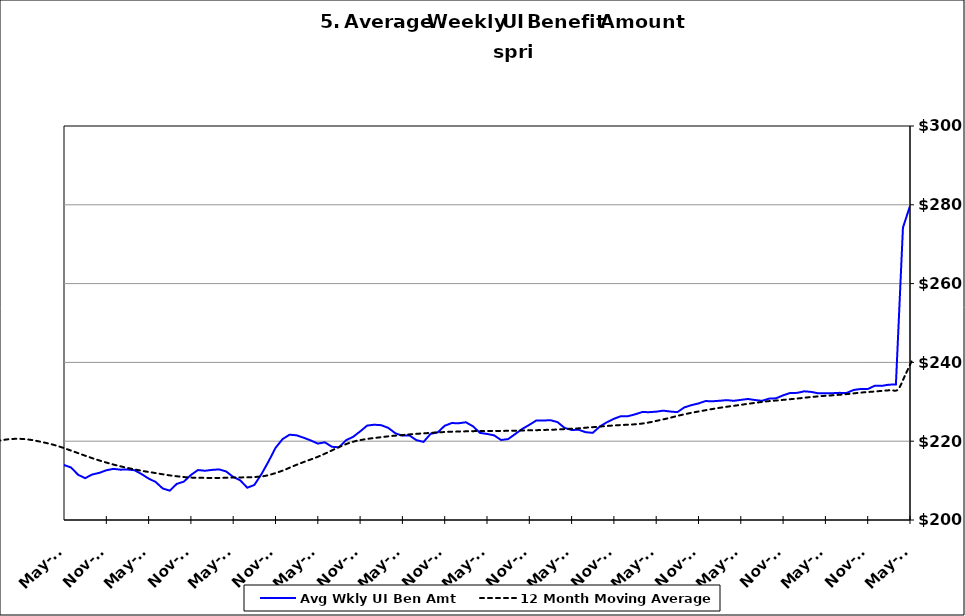
| Category | Avg Wkly UI Ben Amt |
|---|---|
| 1995-01-31 | 152.517 |
| 1995-02-28 | 151.164 |
| 1995-03-31 | 148.4 |
| 1995-04-30 | 146.034 |
| 1995-05-31 | 146.738 |
| 1995-06-30 | 147.885 |
| 1995-07-31 | 145.798 |
| 1995-08-31 | 144.052 |
| 1995-09-30 | 147.334 |
| 1995-10-31 | 151.535 |
| 1995-11-30 | 152.903 |
| 1995-12-31 | 153.258 |
| 1996-01-15 | 153.468 |
| 1996-02-15 | 153.032 |
| 1996-03-15 | 155.453 |
| 1996-04-15 | 148.614 |
| 1996-05-15 | 148.648 |
| 1996-06-15 | 150.145 |
| 1996-07-15 | 147.052 |
| 1996-08-15 | 146.042 |
| 1996-09-15 | 149.978 |
| 1996-10-15 | 151.319 |
| 1996-11-15 | 153.295 |
| 1996-12-15 | 155.775 |
| 1997-01-15 | 154.813 |
| 1997-02-15 | 151.102 |
| 1997-03-15 | 149.222 |
| 1997-04-15 | 145.178 |
| 1997-05-31 | 145.194 |
| 1997-06-30 | 146.718 |
| 1997-07-31 | 142.224 |
| 1997-08-31 | 142.382 |
| 1997-09-30 | 143.123 |
| 1997-10-31 | 146.797 |
| 1997-11-30 | 148.163 |
| 1997-12-31 | 147.967 |
| 1998-01-31 | 147.87 |
| 1998-02-28 | 147.591 |
| 1998-03-31 | 147.262 |
| 1998-04-30 | 144.746 |
| 1998-05-31 | 146.093 |
| 1998-06-30 | 147.355 |
| 1998-07-31 | 146.079 |
| 1998-08-31 | 147.387 |
| 1998-09-30 | 147.529 |
| 1998-10-31 | 152.825 |
| 1998-11-30 | 156.171 |
| 1998-12-31 | 156.424 |
| 1999-01-31 | 157.388 |
| 1999-02-28 | 157.868 |
| 1999-03-31 | 157.505 |
| 1999-04-30 | 153.987 |
| 1999-05-31 | 153.665 |
| 1999-06-30 | 153.746 |
| 1999-07-31 | 154.09 |
| 1999-08-31 | 156.162 |
| 1999-09-30 | 157.136 |
| 1999-10-31 | 162.476 |
| 1999-11-30 | 163.291 |
| 1999-12-31 | 165.621 |
| 2000-01-31 | 166.425 |
| 2000-02-29 | 165.378 |
| 2000-03-31 | 163.05 |
| 2000-04-30 | 161.908 |
| 2000-05-31 | 160.484 |
| 2000-06-30 | 160.865 |
| 2000-07-31 | 161.011 |
| 2000-08-31 | 158.845 |
| 2000-09-30 | 161.127 |
| 2000-10-31 | 163.997 |
| 2000-11-30 | 164.759 |
| 2000-12-31 | 166.66 |
| 2001-01-31 | 168.164 |
| 2001-02-28 | 169.339 |
| 2001-03-31 | 169.617 |
| 2001-04-30 | 170.349 |
| 2001-05-31 | 168.417 |
| 2001-06-30 | 169.418 |
| 2001-07-31 | 169.733 |
| 2001-08-31 | 170.578 |
| 2001-09-30 | 174.36 |
| 2001-10-31 | 176.952 |
| 2001-11-30 | 178.489 |
| 2001-12-31 | 179.805 |
| 2002-01-31 | 179.529 |
| 2002-02-28 | 179.269 |
| 2002-03-31 | 178.588 |
| 2002-04-30 | 177.594 |
| 2002-05-31 | 175.021 |
| 2002-06-30 | 175.298 |
| 2002-07-31 | 173.853 |
| 2002-08-31 | 172.776 |
| 2002-09-30 | 174.657 |
| 2002-10-31 | 175.648 |
| 2002-11-30 | 176.299 |
| 2002-12-31 | 177.239 |
| 2003-01-31 | 176.943 |
| 2003-02-28 | 176.988 |
| 2003-03-31 | 175.698 |
| 2003-04-30 | 172.857 |
| 2003-05-31 | 171.934 |
| 2003-06-30 | 171.956 |
| 2003-07-31 | 170.949 |
| 2003-08-31 | 171.311 |
| 2003-09-30 | 171.909 |
| 2003-10-31 | 172.692 |
| 2003-11-30 | 173.689 |
| 2003-12-31 | 174.176 |
| 2004-01-31 | 173.867 |
| 2004-02-29 | 173.648 |
| 2004-03-31 | 172.152 |
| 2004-04-30 | 170.705 |
| 2004-05-31 | 170.684 |
| 2004-06-30 | 170.635 |
| 2004-07-31 | 171.229 |
| 2004-08-31 | 175.375 |
| 2004-09-30 | 182.737 |
| 2004-10-31 | 187.554 |
| 2004-11-30 | 191.316 |
| 2004-12-31 | 194.602 |
| 2005-01-31 | 196.38 |
| 2005-02-28 | 196.569 |
| 2005-03-31 | 195.523 |
| 2005-04-30 | 193.655 |
| 2005-05-31 | 193.953 |
| 2005-06-30 | 192.728 |
| 2005-07-31 | 192.211 |
| 2005-08-31 | 191.133 |
| 2005-09-30 | 194.339 |
| 2005-10-31 | 196.819 |
| 2005-11-30 | 198.473 |
| 2005-12-31 | 199.545 |
| 2006-01-31 | 199.965 |
| 2006-02-28 | 200.117 |
| 2006-03-31 | 198.335 |
| 2006-04-30 | 197.258 |
| 2006-05-31 | 195.225 |
| 2006-06-30 | 195.734 |
| 2006-07-31 | 194.92 |
| 2006-08-31 | 194.282 |
| 2006-09-30 | 196.801 |
| 2006-10-31 | 199.137 |
| 2006-11-30 | 201.183 |
| 2006-12-31 | 202.121 |
| 2007-01-31 | 202.615 |
| 2007-02-28 | 202.465 |
| 2007-03-31 | 201.75 |
| 2007-04-30 | 200.344 |
| 2007-05-31 | 198.851 |
| 2007-06-30 | 198.258 |
| 2007-07-30 | 197.654 |
| 2007-08-31 | 198.405 |
| 2007-09-30 | 200.563 |
| 2007-10-31 | 201.857 |
| 2007-11-15 | 203.345 |
| 2007-12-15 09:36:00 | 219.243 |
| 2008-01-14 19:12:00 | 219.658 |
| 2008-02-14 04:48:00 | 220.121 |
| 2008-03-15 14:24:00 | 219.456 |
| 2008-04-15 | 217.672 |
| 2008-05-15 09:36:00 | 216.637 |
| 2008-06-14 19:12:00 | 216.035 |
| 2008-07-15 04:48:00 | 213.916 |
| 2008-08-14 14:24:00 | 214.008 |
| 2008-09-14 | 216.475 |
| 2008-10-14 09:36:00 | 217.836 |
| 2008-11-13 19:12:00 | 219.819 |
| 2008-12-14 04:48:00 | 221.529 |
| 2009-01-13 14:24:00 | 222.143 |
| 2009-02-13 | 222.091 |
| 2009-03-15 09:36:00 | 222.273 |
| 2009-04-14 19:12:00 | 222.011 |
| 2009-05-15 04:48:00 | 221.558 |
| 2009-06-14 14:24:00 | 220.761 |
| 2009-07-15 | 219.225 |
| 2009-08-14 09:36:00 | 218.364 |
| 2009-09-13 19:12:00 | 218.814 |
| 2009-10-14 04:48:00 | 218.744 |
| 2009-11-13 14:24:00 | 218.719 |
| 2009-12-14 | 218.779 |
| 2010-01-13 09:36:00 | 217.988 |
| 2010-02-12 19:12:00 | 217.521 |
| 2010-03-15 04:48:00 | 216.93 |
| 2010-04-14 14:24:00 | 215.638 |
| 2010-05-15 | 213.953 |
| 2010-06-14 09:36:00 | 213.326 |
| 2010-07-14 19:12:00 | 211.48 |
| 2010-08-14 04:48:00 | 210.615 |
| 2010-09-13 14:24:00 | 211.554 |
| 2010-10-14 | 211.956 |
| 2010-11-13 09:36:00 | 212.619 |
| 2010-12-13 19:12:00 | 212.979 |
| 2011-01-13 04:48:00 | 212.778 |
| 2011-02-12 14:24:00 | 212.812 |
| 2011-03-15 | 212.631 |
| 2011-04-14 09:36:00 | 211.659 |
| 2011-05-14 19:12:00 | 210.522 |
| 2011-06-14 04:48:00 | 209.652 |
| 2011-07-14 14:24:00 | 208.005 |
| 2011-08-14 | 207.451 |
| 2011-09-13 09:36:00 | 209.173 |
| 2011-10-13 19:12:00 | 209.736 |
| 2011-11-13 04:48:00 | 211.422 |
| 2011-12-13 14:24:00 | 212.679 |
| 2012-01-13 | 212.502 |
| 2012-02-12 09:36:00 | 212.715 |
| 2012-03-13 19:12:00 | 212.846 |
| 2012-04-13 04:48:00 | 212.323 |
| 2012-05-13 14:24:00 | 210.934 |
| 2012-06-13 | 210.073 |
| 2012-07-13 09:36:00 | 208.192 |
| 2012-08-12 19:12:00 | 208.902 |
| 2012-09-12 04:48:00 | 211.616 |
| 2012-10-12 14:24:00 | 214.814 |
| 2012-11-12 | 218.296 |
| 2012-12-12 09:36:00 | 220.532 |
| 2013-01-11 19:12:00 | 221.653 |
| 2013-02-11 04:48:00 | 221.49 |
| 2013-03-13 14:24:00 | 220.877 |
| 2013-04-13 | 220.198 |
| 2013-05-13 09:36:00 | 219.395 |
| 2013-06-12 19:12:00 | 219.716 |
| 2013-07-13 04:48:00 | 218.588 |
| 2013-08-12 14:24:00 | 218.444 |
| 2013-09-12 | 220.248 |
| 2013-10-12 09:36:00 | 221.094 |
| 2013-11-11 19:12:00 | 222.471 |
| 2013-12-12 04:48:00 | 223.964 |
| 2014-01-11 14:24:00 | 224.183 |
| 2014-02-11 | 224.065 |
| 2014-03-13 09:36:00 | 223.376 |
| 2014-04-12 19:12:00 | 222.017 |
| 2014-05-13 04:48:00 | 221.409 |
| 2014-06-12 14:24:00 | 221.458 |
| 2014-07-13 | 220.256 |
| 2014-08-12 09:36:00 | 219.823 |
| 2014-09-11 19:12:00 | 221.87 |
| 2014-10-12 04:48:00 | 222.223 |
| 2014-11-11 14:24:00 | 223.919 |
| 2014-12-12 | 224.606 |
| 2015-01-11 09:36:00 | 224.554 |
| 2015-02-10 19:12:00 | 224.808 |
| 2015-03-13 04:48:00 | 223.795 |
| 2015-04-12 14:24:00 | 222.11 |
| 2015-05-13 | 221.845 |
| 2015-06-12 09:36:00 | 221.492 |
| 2015-07-12 19:12:00 | 220.308 |
| 2015-08-12 04:48:00 | 220.534 |
| 2015-09-11 14:24:00 | 221.819 |
| 2015-10-12 | 223.117 |
| 2015-11-11 09:36:00 | 224.146 |
| 2015-12-11 19:12:00 | 225.264 |
| 2016-01-11 04:48:00 | 225.247 |
| 2016-02-10 14:24:00 | 225.331 |
| 2016-03-12 | 224.849 |
| 2016-04-11 09:36:00 | 223.376 |
| 2016-05-11 19:12:00 | 222.856 |
| 2016-06-11 04:48:00 | 222.895 |
| 2016-07-11 14:24:00 | 222.285 |
| 2016-08-11 | 222.119 |
| 2016-09-10 09:36:00 | 223.72 |
| 2016-10-10 19:12:00 | 224.805 |
| 2016-11-10 04:48:00 | 225.687 |
| 2016-12-10 14:24:00 | 226.349 |
| 2017-01-10 | 226.348 |
| 2017-02-09 09:36:00 | 226.816 |
| 2017-03-11 19:12:00 | 227.395 |
| 2017-04-11 04:48:00 | 227.37 |
| 2017-05-11 14:24:00 | 227.492 |
| 2017-06-11 | 227.755 |
| 2017-07-11 09:36:00 | 227.522 |
| 2017-08-10 19:12:00 | 227.382 |
| 2017-09-10 04:48:00 | 228.581 |
| 2017-10-10 14:24:00 | 229.154 |
| 2017-11-10 | 229.58 |
| 2017-12-10 09:36:00 | 230.186 |
| 2018-01-09 19:12:00 | 230.136 |
| 2018-02-09 04:48:00 | 230.265 |
| 2018-03-11 14:24:00 | 230.427 |
| 2018-04-11 | 230.25 |
| 2018-05-11 09:36:00 | 230.487 |
| 2018-06-10 19:12:00 | 230.714 |
| 2018-07-11 04:48:00 | 230.457 |
| 2018-08-10 14:24:00 | 230.244 |
| 2018-09-10 | 230.802 |
| 2018-10-10 09:36:00 | 230.887 |
| 2018-11-09 19:12:00 | 231.636 |
| 2018-12-10 04:48:00 | 232.24 |
| 2019-01-09 14:24:00 | 232.268 |
| 2019-02-09 | 232.662 |
| 2019-03-11 09:36:00 | 232.508 |
| 2019-04-10 19:12:00 | 232.152 |
| 2019-05-11 04:48:00 | 232.145 |
| 2019-06-10 14:24:00 | 232.186 |
| 2019-07-11 | 232.27 |
| 2019-08-10 09:36:00 | 232.238 |
| 2019-09-09 19:12:00 | 232.999 |
| 2019-10-10 04:48:00 | 233.25 |
| 2019-11-09 14:24:00 | 233.231 |
| 2019-12-10 | 234.074 |
| 2020-01-09 09:36:00 | 234.041 |
| 2020-02-08 19:12:00 | 234.352 |
| 2020-03-10 04:48:00 | 234.377 |
| 2020-04-09 14:24:00 | 274.215 |
| 2020-05-10 | 279.707 |